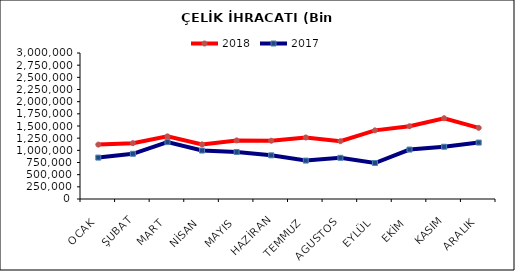
| Category | 2018 | 2017 |
|---|---|---|
| OCAK | 1117501.037 | 850631.402 |
| ŞUBAT | 1147472.135 | 928852.77 |
| MART | 1287275.134 | 1169206.05 |
| NİSAN | 1122432.774 | 995610.368 |
| MAYIS | 1204113.153 | 965129.353 |
| HAZİRAN | 1197087.354 | 897059.505 |
| TEMMUZ | 1263952.757 | 789361.785 |
| AGUSTOS | 1187188.734 | 846235.763 |
| EYLÜL | 1410550.096 | 739616.713 |
| EKİM | 1495047.83 | 1016087.502 |
| KASIM | 1659913.539 | 1073414.376 |
| ARALIK | 1462326.748 | 1159659.113 |